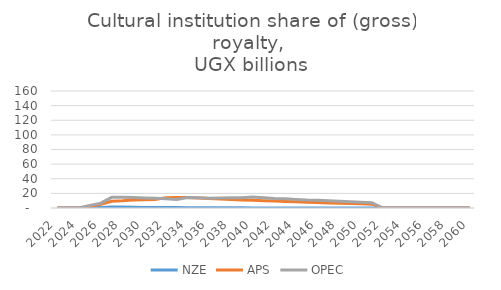
| Category | NZE | APS | OPEC |
|---|---|---|---|
| 2022.0 | 0 | 0 | 0 |
| 2023.0 | 0 | 0 | 0 |
| 2024.0 | 0 | 0 | 0 |
| 2025.0 | 0.403 | 2.316 | 3.384 |
| 2026.0 | 0.748 | 5.075 | 6.623 |
| 2027.0 | 1.321 | 9.271 | 14.613 |
| 2028.0 | 1.321 | 9.866 | 14.752 |
| 2029.0 | 0.935 | 11.057 | 14.235 |
| 2030.0 | 0.548 | 11.251 | 13.732 |
| 2031.0 | 0.547 | 11.728 | 13.24 |
| 2032.0 | 0.546 | 14.162 | 12.694 |
| 2033.0 | 0.524 | 14.498 | 11.747 |
| 2034.0 | 0.492 | 14.431 | 14.431 |
| 2035.0 | 0.453 | 13.75 | 13.977 |
| 2036.0 | 0.418 | 13.057 | 13.465 |
| 2037.0 | 0.385 | 12.363 | 13.831 |
| 2038.0 | 0.355 | 11.675 | 13.985 |
| 2039.0 | 0.327 | 11 | 13.968 |
| 2040.0 | 0.089 | 10.476 | 15.147 |
| 2041.0 | 0 | 9.945 | 14.014 |
| 2042.0 | 0 | 9.416 | 12.926 |
| 2043.0 | 0 | 8.893 | 12.74 |
| 2044.0 | 0 | 8.381 | 11.756 |
| 2045.0 | 0 | 7.883 | 10.851 |
| 2046.0 | 0 | 7.402 | 10.659 |
| 2047.0 | 0 | 6.94 | 9.844 |
| 2048.0 | 0 | 6.497 | 9.094 |
| 2049.0 | 0 | 6.076 | 8.403 |
| 2050.0 | 0 | 5.675 | 7.768 |
| 2051.0 | 0 | 5.248 | 7.184 |
| 2052.0 | 0 | 0 | 0 |
| 2053.0 | 0 | 0 | 0 |
| 2054.0 | 0 | 0 | 0 |
| 2055.0 | 0 | 0 | 0 |
| 2056.0 | 0 | 0 | 0 |
| 2057.0 | 0 | 0 | 0 |
| 2058.0 | 0 | 0 | 0 |
| 2059.0 | 0 | 0 | 0 |
| 2060.0 | 0 | 0 | 0 |